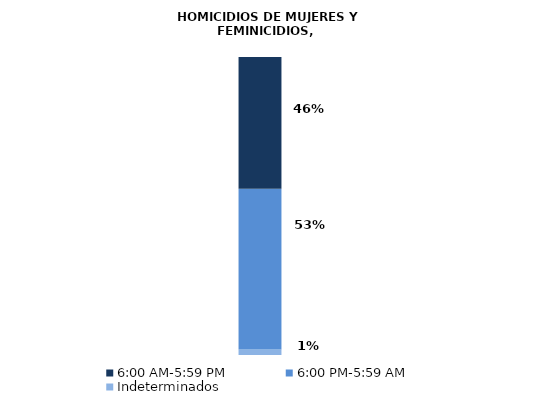
| Category | Indeterminados | 6:00 PM-5:59 AM | 6:00 AM-5:59 PM |
|---|---|---|---|
| 0 | 3 | 89 | 73 |